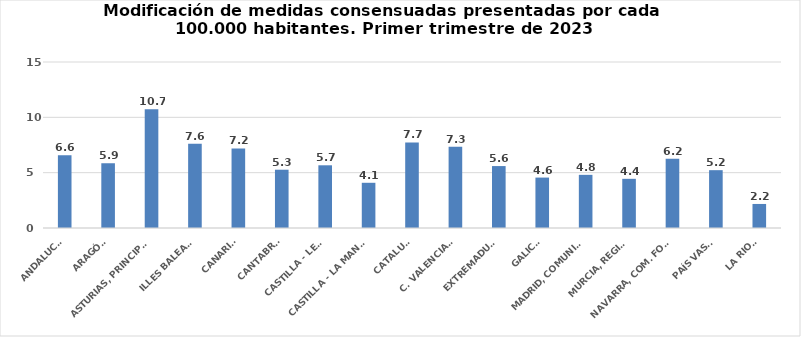
| Category | Series 0 |
|---|---|
| ANDALUCÍA | 6.575 |
| ARAGÓN | 5.855 |
| ASTURIAS, PRINCIPADO | 10.729 |
| ILLES BALEARS | 7.624 |
| CANARIAS | 7.185 |
| CANTABRIA | 5.267 |
| CASTILLA - LEÓN | 5.666 |
| CASTILLA - LA MANCHA | 4.085 |
| CATALUÑA | 7.735 |
| C. VALENCIANA | 7.34 |
| EXTREMADURA | 5.596 |
| GALICIA | 4.556 |
| MADRID, COMUNIDAD | 4.804 |
| MURCIA, REGIÓN | 4.444 |
| NAVARRA, COM. FORAL | 6.248 |
| PAÍS VASCO | 5.225 |
| LA RIOJA | 2.172 |